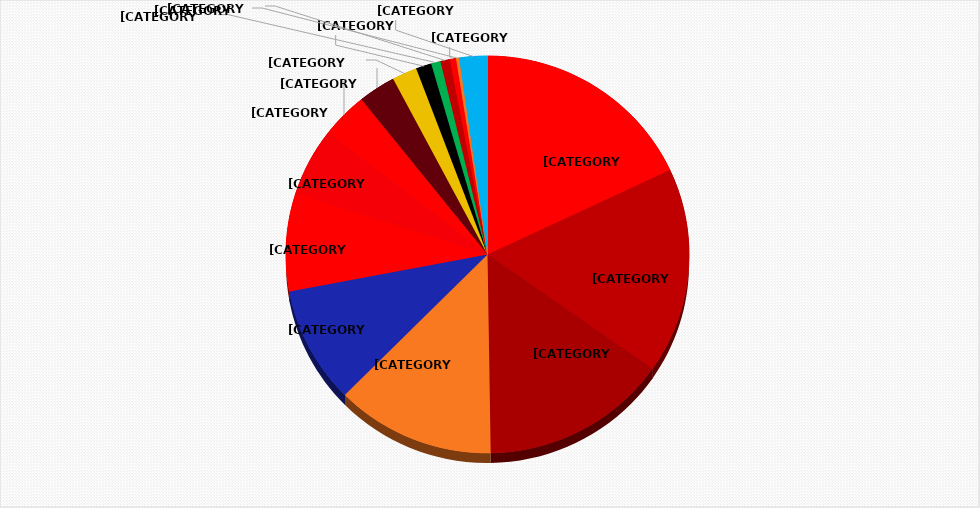
| Category | Series 0 |
|---|---|
| Alabama 72% | 72 |
| Ohio State 67% | 67 |
| Georgia 60% | 60 |
| Clemson 51%  | 51 |
| Michigan 38% | 38 |
| Utah 32% | 32 |
| NC State 22% | 22 |
| Oklahoma 15% | 15 |
| Texas A&M 12% | 12 |
| Notre Dame 8% | 8 |
| Cincinnati 5% | 5 |
| Oregon 3% | 3 |
| Arkansas 3% | 3 |
| USC 2% | 2 |
| Miami 1% | 1 |
| Others 9% | 9 |